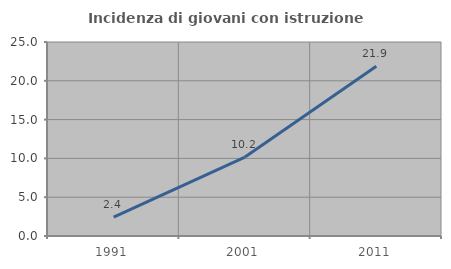
| Category | Incidenza di giovani con istruzione universitaria |
|---|---|
| 1991.0 | 2.439 |
| 2001.0 | 10.169 |
| 2011.0 | 21.875 |